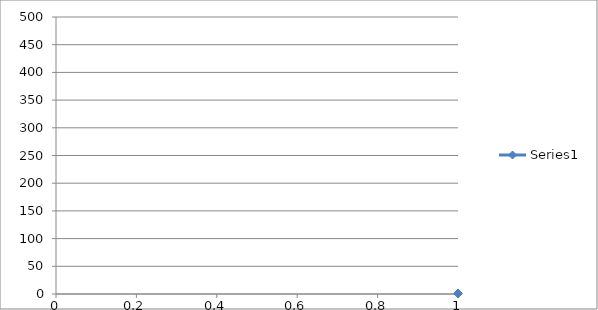
| Category | Series 0 |
|---|---|
| 0 | 0.845 |
| 1 | 0.962 |
| 2 | 1.055 |
| 3 | 1.142 |
| 4 | 1.224 |
| 5 | 1.328 |
| 6 | 1.431 |
| 7 | 1.538 |
| 8 | 1.68 |
| 9 | 1.806 |
| 10 | 1.965 |
| 11 | 2.137 |
| 12 | 2.33 |
| 13 | 2.525 |
| 14 | 2.787 |
| 15 | 3.061 |
| 16 | 3.376 |
| 17 | 3.739 |
| 18 | 4.145 |
| 19 | 4.636 |
| 20 | 5.192 |
| 21 | 5.842 |
| 22 | 6.628 |
| 23 | 8.049 |
| 24 | 9.327 |
| 25 | 10.766 |
| 26 | 12.433 |
| 27 | 15.072 |
| 28 | 17.66 |
| 29 | 21.592 |
| 30 | 26.457 |
| 31 | 28.854 |
| 32 | 31.329 |
| 33 | 34.083 |
| 34 | 37.383 |
| 35 | 41.317 |
| 36 | 45.352 |
| 37 | 49.824 |
| 38 | 54.917 |
| 39 | 60.568 |
| 40 | 66.819 |
| 41 | 73.996 |
| 42 | 81.979 |
| 43 | 90.917 |
| 44 | 100.319 |
| 45 | 111.105 |
| 46 | 122.604 |
| 47 | 136.08 |
| 48 | 149.886 |
| 49 | 164.96 |
| 50 | 180.932 |
| 51 | 197.896 |
| 52 | 215.061 |
| 53 | 233.096 |
| 54 | 251.951 |
| 55 | 270.345 |
| 56 | 288.932 |
| 57 | 307.669 |
| 58 | 325.681 |
| 59 | 342.695 |
| 60 | 359.297 |
| 61 | 374.308 |
| 62 | 388.503 |
| 63 | 400.939 |
| 64 | 412.717 |
| 65 | 422.967 |
| 66 | 432.045 |
| 67 | 440.044 |
| 68 | 446.86 |
| 69 | 452.359 |
| 70 | 456.944 |
| 71 | 460.424 |
| 72 | 463.931 |
| 73 | 465.701 |
| 74 | 467.438 |
| 75 | 468.846 |
| 76 | 469.355 |
| 77 | 469.868 |
| 78 | 470.248 |
| 79 | 470.475 |
| 80 | 470.576 |
| 81 | 470.57 |
| 82 | 470.465 |
| 83 | 470.194 |
| 84 | 469.785 |
| 85 | 469.109 |
| 86 | 467.629 |
| 87 | 465.968 |
| 88 | 463.496 |
| 89 | 460.771 |
| 90 | 456.885 |
| 91 | 452.54 |
| 92 | 446.748 |
| 93 | 440.536 |
| 94 | 432.612 |
| 95 | 423.559 |
| 96 | 413.45 |
| 97 | 401.842 |
| 98 | 388.879 |
| 99 | 375.091 |
| 100 | 359.764 |
| 101 | 344.092 |
| 102 | 326.795 |
| 103 | 308.985 |
| 104 | 291.142 |
| 105 | 272.447 |
| 106 | 253.661 |
| 107 | 234.952 |
| 108 | 216.715 |
| 109 | 199.263 |
| 110 | 182.226 |
| 111 | 166.508 |
| 112 | 150.971 |
| 113 | 137.247 |
| 114 | 124.254 |
| 115 | 112.441 |
| 116 | 101.691 |
| 117 | 92.136 |
| 118 | 83.262 |
| 119 | 75.011 |
| 120 | 68.229 |
| 121 | 61.453 |
| 122 | 56.119 |
| 123 | 50.522 |
| 124 | 46.416 |
| 125 | 42.406 |
| 126 | 38.415 |
| 127 | 35.317 |
| 128 | 32.374 |
| 129 | 29.676 |
| 130 | 27.541 |
| 131 | 22.253 |
| 132 | 18.305 |
| 133 | 15.486 |
| 134 | 12.954 |
| 135 | 11.383 |
| 136 | 9.731 |
| 137 | 8.39 |
| 138 | 7.766 |
| 139 | 6.978 |
| 140 | 6.189 |
| 141 | 5.526 |
| 142 | 4.936 |
| 143 | 4.442 |
| 144 | 4.034 |
| 145 | 3.655 |
| 146 | 3.341 |
| 147 | 3.048 |
| 148 | 2.797 |
| 149 | 2.581 |
| 150 | 2.394 |
| 151 | 2.228 |
| 152 | 2.088 |
| 153 | 1.943 |
| 154 | 1.801 |
| 155 | 1.688 |
| 156 | 1.608 |
| 157 | 1.52 |
| 158 | 1.429 |
| 159 | 1.342 |
| 160 | 1.277 |